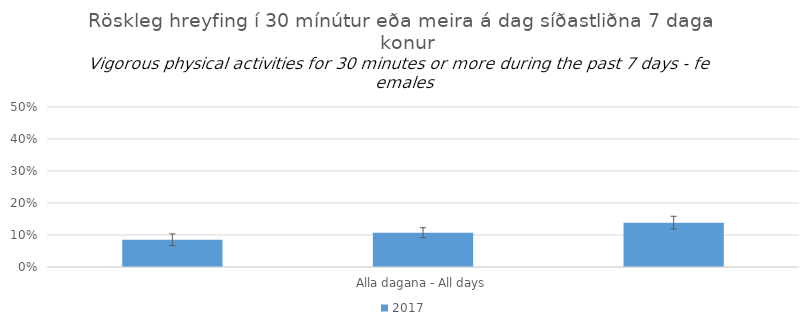
| Category | 2017 |
|---|---|
| 0 | 0.085 |
| 1 | 0.107 |
| 2 | 0.139 |